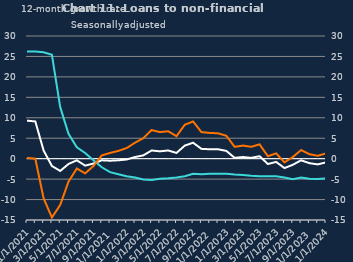
| Category | zero | Non-financial businesses | SMEs |
|---|---|---|---|
| Jan-2021 |  | 9.3 | 26.2 |
| Feb-2021 |  | 9.1 | 26.2 |
| Mar-2021 |  | 2 | 26 |
| Apr-2021 |  | -1.8 | 25.4 |
| May-2021 |  | -3 | 12.6 |
| Jun-2021 |  | -1.3 | 6.1 |
| Jul-2021 |  | -0.4 | 2.8 |
| Aug-2021 |  | -1.7 | 1.4 |
| Sep-2021 |  | -1.2 | -0.4 |
| Oct-2021 |  | -0.4 | -2.1 |
| Nov-2021 |  | -0.5 | -3.3 |
| Dec-2021 |  | -0.4 | -3.8 |
| Jan-2022 |  | -0.2 | -4.3 |
| Feb-2022 |  | 0.4 | -4.6 |
| Mar-2022 |  | 0.8 | -5.1 |
| Apr-2022 |  | 2 | -5.2 |
| May-2022 |  | 1.8 | -4.9 |
| Jun-2022 |  | 2 | -4.8 |
| Jul-2022 |  | 1.4 | -4.6 |
| Aug-2022 |  | 3.2 | -4.3 |
| Sep-2022 |  | 3.9 | -3.7 |
| Oct-2022 |  | 2.4 | -3.8 |
| Nov-2022 |  | 2.3 | -3.7 |
| Dec-2022 |  | 2.3 | -3.7 |
| Jan-2023 |  | 1.9 | -3.7 |
| Feb-2023 |  | 0.2 | -3.9 |
| Mar-2023 |  | 0.4 | -4 |
| Apr-2023 |  | 0.2 | -4.2 |
| May-2023 |  | 0.6 | -4.3 |
| Jun-2023 |  | -1.3 | -4.3 |
| Jul-2023 |  | -0.8 | -4.3 |
| Aug-2023 |  | -2.3 | -4.6 |
| Sep-2023 |  | -1.5 | -5 |
| Oct-2023 |  | -0.4 | -4.6 |
| Nov-2023 |  | -1.1 | -4.9 |
| Dec-2023 |  | -1.4 | -5 |
| Jan-2024 |  | -0.9 | -4.8 |